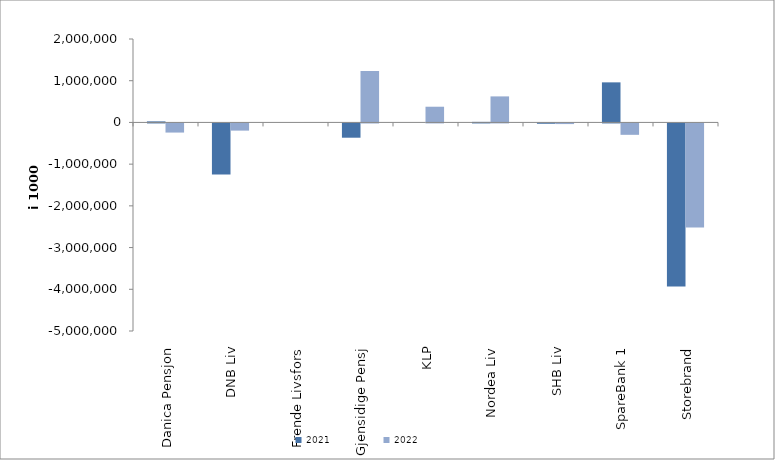
| Category | 2021 | 2022 |
|---|---|---|
| Danica Pensjon | 24962.468 | -219078.763 |
| DNB Liv | -1227148 | -172405 |
| Frende Livsfors | 0 | 0 |
| Gjensidige Pensj | -342266 | 1232079 |
| KLP | 0 | 376440.529 |
| Nordea Liv | 13147.515 | 624143.677 |
| SHB Liv | -7905.02 | -15435.86 |
| SpareBank 1 | 960545.455 | -273107.306 |
| Storebrand | -3907287.845 | -2494222.933 |